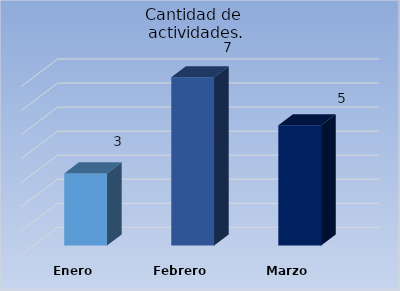
| Category | Cantidad de 
actividades. |
|---|---|
| Enero | 3 |
| Febrero | 7 |
| Marzo | 5 |